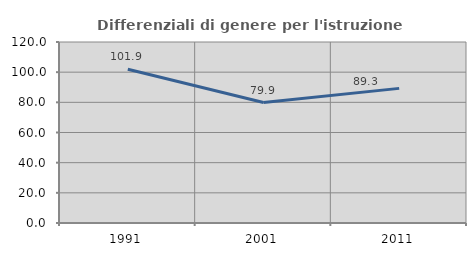
| Category | Differenziali di genere per l'istruzione superiore |
|---|---|
| 1991.0 | 101.908 |
| 2001.0 | 79.885 |
| 2011.0 | 89.258 |